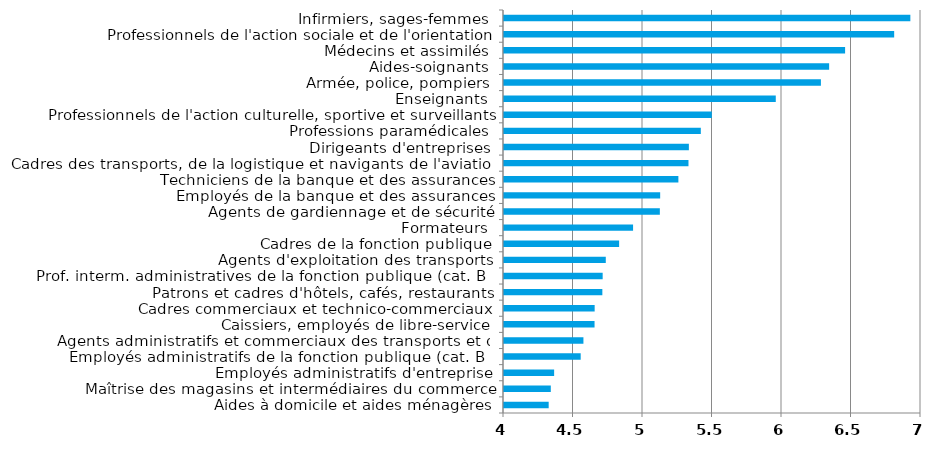
| Category | Series 0 |
|---|---|
| Aides à domicile et aides ménagères | 4.321 |
| Maîtrise des magasins et intermédiaires du commerce | 4.337 |
| Employés administratifs d'entreprise | 4.361 |
| Employés administratifs de la fonction publique (cat. B et assimilés) | 4.552 |
| Agents administratifs et commerciaux des transports et du tourisme | 4.571 |
| Caissiers, employés de libre-service | 4.651 |
| Cadres commerciaux et technico-commerciaux | 4.652 |
| Patrons et cadres d'hôtels, cafés, restaurants | 4.708 |
| Prof. interm. administratives de la fonction publique (cat. B et assimilés) | 4.71 |
| Agents d'exploitation des transports | 4.732 |
| Cadres de la fonction publique | 4.828 |
| Formateurs | 4.929 |
| Agents de gardiennage et de sécurité | 5.121 |
| Employés de la banque et des assurances | 5.124 |
| Techniciens de la banque et des assurances | 5.255 |
| Cadres des transports, de la logistique et navigants de l'aviation | 5.327 |
| Dirigeants d'entreprises | 5.33 |
| Professions paramédicales | 5.416 |
| Professionnels de l'action culturelle, sportive et surveillants | 5.495 |
| Enseignants | 5.955 |
| Armée, police, pompiers | 6.28 |
| Aides-soignants | 6.339 |
| Médecins et assimilés | 6.454 |
| Professionnels de l'action sociale et de l'orientation | 6.807 |
| Infirmiers, sages-femmes | 6.923 |